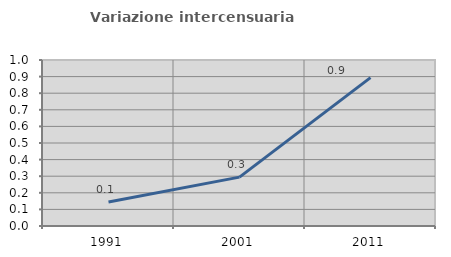
| Category | Variazione intercensuaria annua |
|---|---|
| 1991.0 | 0.145 |
| 2001.0 | 0.294 |
| 2011.0 | 0.894 |